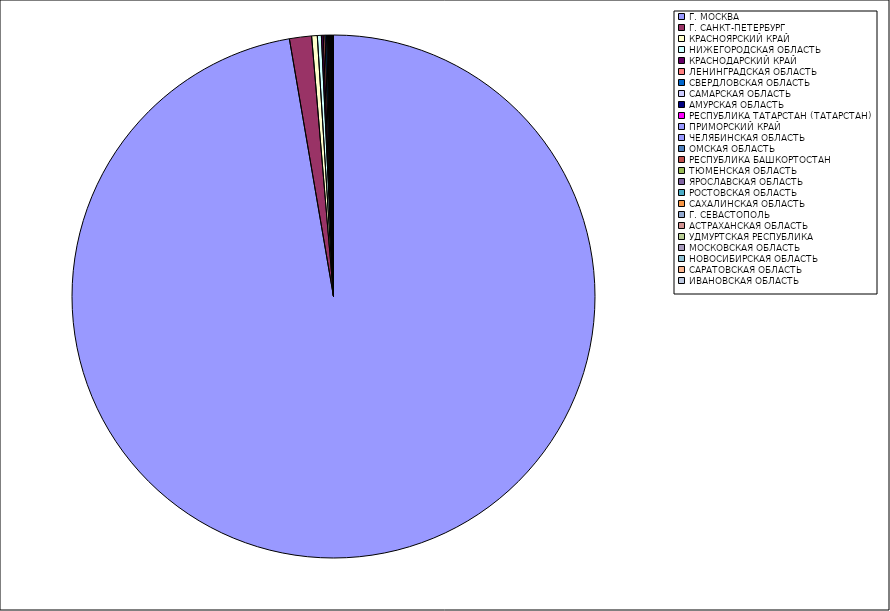
| Category | Оборот |
|---|---|
| Г. МОСКВА | 97.249 |
| Г. САНКТ-ПЕТЕРБУРГ | 1.364 |
| КРАСНОЯРСКИЙ КРАЙ | 0.347 |
| НИЖЕГОРОДСКАЯ ОБЛАСТЬ | 0.248 |
| КРАСНОДАРСКИЙ КРАЙ | 0.112 |
| ЛЕНИНГРАДСКАЯ ОБЛАСТЬ | 0.105 |
| СВЕРДЛОВСКАЯ ОБЛАСТЬ | 0.099 |
| САМАРСКАЯ ОБЛАСТЬ | 0.062 |
| АМУРСКАЯ ОБЛАСТЬ | 0.058 |
| РЕСПУБЛИКА ТАТАРСТАН (ТАТАРСТАН) | 0.057 |
| ПРИМОРСКИЙ КРАЙ | 0.05 |
| ЧЕЛЯБИНСКАЯ ОБЛАСТЬ | 0.034 |
| ОМСКАЯ ОБЛАСТЬ | 0.027 |
| РЕСПУБЛИКА БАШКОРТОСТАН | 0.021 |
| ТЮМЕНСКАЯ ОБЛАСТЬ | 0.019 |
| ЯРОСЛАВСКАЯ ОБЛАСТЬ | 0.017 |
| РОСТОВСКАЯ ОБЛАСТЬ | 0.012 |
| САХАЛИНСКАЯ ОБЛАСТЬ | 0.011 |
| Г. СЕВАСТОПОЛЬ | 0.011 |
| АСТРАХАНСКАЯ ОБЛАСТЬ | 0.01 |
| УДМУРТСКАЯ РЕСПУБЛИКА | 0.009 |
| МОСКОВСКАЯ ОБЛАСТЬ | 0.008 |
| НОВОСИБИРСКАЯ ОБЛАСТЬ | 0.007 |
| САРАТОВСКАЯ ОБЛАСТЬ | 0.006 |
| ИВАНОВСКАЯ ОБЛАСТЬ | 0.005 |